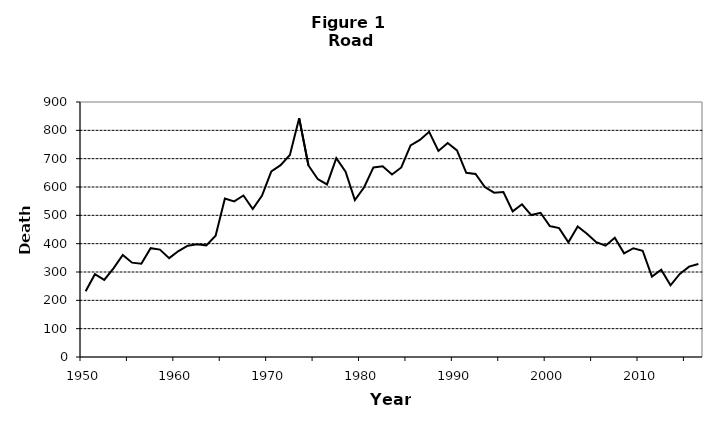
| Category | Series 1 |
|---|---|
| 1950.0 | 232 |
| 1951.0 | 292 |
| 1952.0 | 272 |
| 1953.0 | 313 |
| 1954.0 | 360 |
| 1955.0 | 333 |
| 1956.0 | 329 |
| 1957.0 | 384 |
| 1958.0 | 379 |
| 1959.0 | 349 |
| 1960.0 | 374 |
| 1961.0 | 393 |
| 1962.0 | 398 |
| 1963.0 | 394 |
| 1964.0 | 428 |
| 1965.0 | 559 |
| 1966.0 | 549 |
| 1967.0 | 570 |
| 1968.0 | 522 |
| 1969.0 | 570 |
| 1970.0 | 655 |
| 1971.0 | 677 |
| 1972.0 | 713 |
| 1973.0 | 843 |
| 1974.0 | 676 |
| 1975.0 | 628 |
| 1976.0 | 609 |
| 1977.0 | 702 |
| 1978.0 | 654 |
| 1979.0 | 554 |
| 1980.0 | 599 |
| 1981.0 | 669 |
| 1982.0 | 673 |
| 1983.0 | 644 |
| 1984.0 | 669 |
| 1985.0 | 747 |
| 1986.0 | 766 |
| 1987.0 | 795 |
| 1988.0 | 727 |
| 1989.0 | 755 |
| 1990.0 | 729 |
| 1991.0 | 650 |
| 1992.0 | 646 |
| 1993.0 | 600 |
| 1994.0 | 580 |
| 1995.0 | 582 |
| 1996.0 | 514 |
| 1997.0 | 539 |
| 1998.0 | 501 |
| 1999.0 | 509 |
| 2000.0 | 462 |
| 2001.0 | 455 |
| 2002.0 | 405 |
| 2003.0 | 461 |
| 2004.0 | 435 |
| 2005.0 | 405 |
| 2006.0 | 393 |
| 2007.0 | 421 |
| 2008.0 | 366 |
| 2009.0 | 384 |
| 2010.0 | 375 |
| 2011.0 | 284 |
| 2012.0 | 308 |
| 2013.0 | 253 |
| 2014.0 | 293 |
| 2015.0 | 319 |
| 2016.0 | 328 |